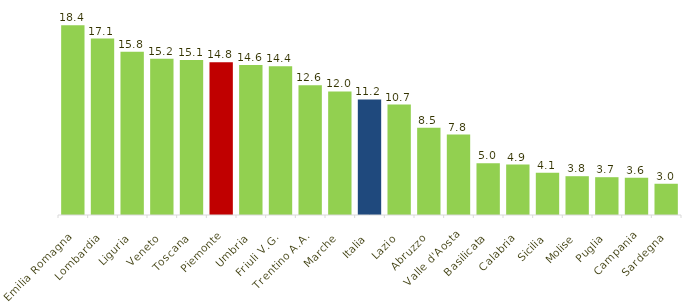
| Category | Studenti con cittadinanza straniera (ogni 100 iscritti)  |
|---|---|
| Emilia Romagna | 18.429 |
| Lombardia | 17.127 |
| Liguria | 15.845 |
| Veneto | 15.163 |
| Toscana | 15.06 |
| Piemonte | 14.829 |
| Umbria | 14.571 |
| Friuli V.G. | 14.443 |
| Trentino A.A. | 12.593 |
| Marche | 12.001 |
| Italia | 11.214 |
| Lazio | 10.718 |
| Abruzzo | 8.464 |
| Valle d'Aosta | 7.806 |
| Basilicata | 5.014 |
| Calabria | 4.895 |
| Sicilia | 4.11 |
| Molise | 3.767 |
| Puglia | 3.671 |
| Campania | 3.626 |
| Sardegna | 3.033 |